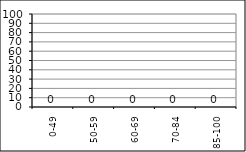
| Category | Series 0 |
|---|---|
| 0-49 | 0 |
| 50-59 | 0 |
| 60-69 | 0 |
| 70-84 | 0 |
| 85-100 | 0 |